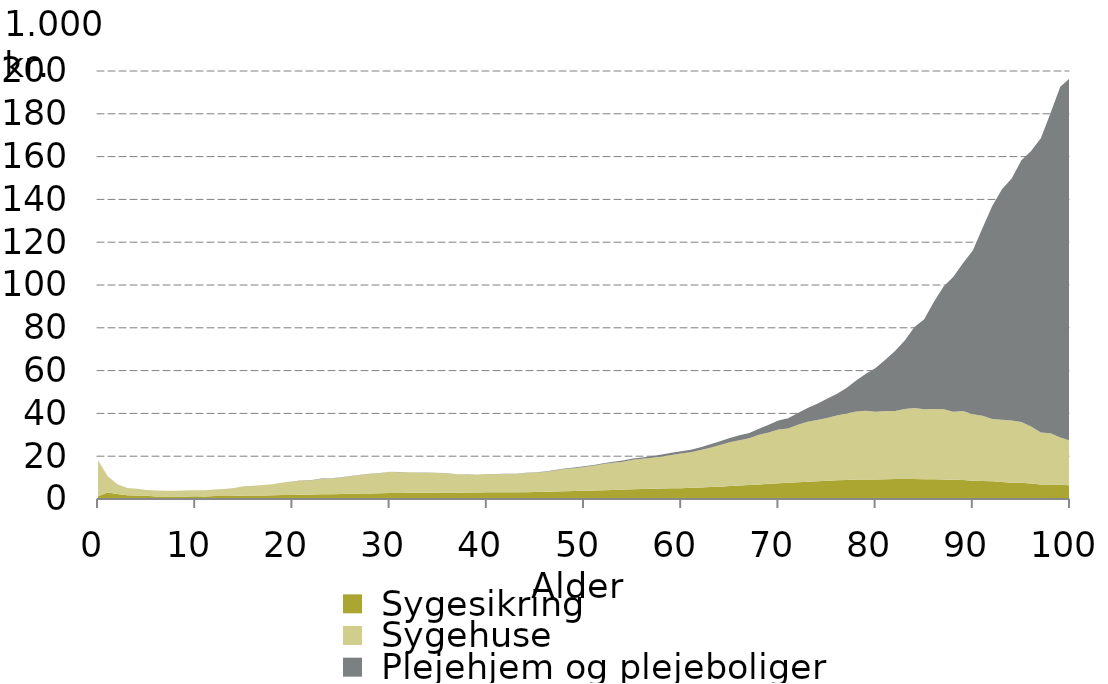
| Category |  Sygesikring |  Sygehuse |  Plejehjem og plejeboliger |
|---|---|---|---|
| 0.0 | 1.234 | 16.832 | 0.005 |
| 1.0 | 3.021 | 7.594 | 0.007 |
| 2.0 | 2.337 | 4.499 | 0.016 |
| 3.0 | 1.73 | 3.426 | 0.007 |
| 4.0 | 1.629 | 3.121 | 0.016 |
| 5.0 | 1.523 | 2.726 | 0.003 |
| 6.0 | 1.224 | 2.746 | 0.003 |
| 7.0 | 1.167 | 2.638 | 0.016 |
| 8.0 | 1.175 | 2.678 | 0.006 |
| 9.0 | 1.198 | 2.72 | 0.006 |
| 10.0 | 1.227 | 2.865 | 0.01 |
| 11.0 | 1.209 | 2.847 | 0.013 |
| 12.0 | 1.375 | 3.094 | 0.009 |
| 13.0 | 1.372 | 3.313 | 0.003 |
| 14.0 | 1.432 | 3.75 | 0.006 |
| 15.0 | 1.589 | 4.386 | 0.009 |
| 16.0 | 1.628 | 4.556 | 0.006 |
| 17.0 | 1.639 | 4.904 | 0.022 |
| 18.0 | 1.7 | 5.135 | 0.028 |
| 19.0 | 1.832 | 5.856 | 0.045 |
| 20.0 | 1.908 | 6.205 | 0.11 |
| 21.0 | 1.985 | 6.697 | 0.075 |
| 22.0 | 2.055 | 6.706 | 0.167 |
| 23.0 | 2.173 | 7.172 | 0.197 |
| 24.0 | 2.235 | 7.359 | 0.151 |
| 25.0 | 2.303 | 7.76 | 0.114 |
| 26.0 | 2.412 | 8.182 | 0.13 |
| 27.0 | 2.516 | 8.753 | 0.107 |
| 28.0 | 2.616 | 9.028 | 0.125 |
| 29.0 | 2.709 | 9.377 | 0.099 |
| 30.0 | 2.782 | 9.929 | 0.072 |
| 31.0 | 2.846 | 9.688 | 0.076 |
| 32.0 | 2.874 | 9.58 | 0.08 |
| 33.0 | 2.924 | 9.391 | 0.049 |
| 34.0 | 2.958 | 9.338 | 0.048 |
| 35.0 | 2.973 | 9.241 | 0.079 |
| 36.0 | 3.008 | 8.948 | 0.084 |
| 37.0 | 2.965 | 8.561 | 0.079 |
| 38.0 | 3.04 | 8.454 | 0.056 |
| 39.0 | 3.058 | 8.406 | 0.041 |
| 40.0 | 3.12 | 8.562 | 0.058 |
| 41.0 | 3.121 | 8.453 | 0.112 |
| 42.0 | 3.118 | 8.545 | 0.11 |
| 43.0 | 3.148 | 8.536 | 0.146 |
| 44.0 | 3.209 | 8.913 | 0.138 |
| 45.0 | 3.315 | 9.064 | 0.152 |
| 46.0 | 3.369 | 9.296 | 0.175 |
| 47.0 | 3.456 | 9.907 | 0.233 |
| 48.0 | 3.606 | 10.388 | 0.225 |
| 49.0 | 3.716 | 10.699 | 0.289 |
| 50.0 | 3.815 | 11.155 | 0.326 |
| 51.0 | 3.916 | 11.672 | 0.335 |
| 52.0 | 4.036 | 12.302 | 0.388 |
| 53.0 | 4.202 | 12.742 | 0.468 |
| 54.0 | 4.39 | 13.05 | 0.553 |
| 55.0 | 4.545 | 13.755 | 0.645 |
| 56.0 | 4.624 | 14.132 | 0.675 |
| 57.0 | 4.761 | 14.536 | 0.769 |
| 58.0 | 4.908 | 15.002 | 0.927 |
| 59.0 | 5.027 | 15.581 | 1.03 |
| 60.0 | 5.079 | 16.156 | 1.038 |
| 61.0 | 5.23 | 16.648 | 1.092 |
| 62.0 | 5.396 | 17.533 | 1.27 |
| 63.0 | 5.575 | 18.404 | 1.555 |
| 64.0 | 5.747 | 19.491 | 1.782 |
| 65.0 | 6.031 | 20.449 | 2.048 |
| 66.0 | 6.349 | 21.145 | 2.253 |
| 67.0 | 6.57 | 21.86 | 2.43 |
| 68.0 | 6.831 | 23.199 | 2.765 |
| 69.0 | 7.124 | 23.976 | 3.626 |
| 70.0 | 7.417 | 25.07 | 4.176 |
| 71.0 | 7.553 | 25.383 | 4.749 |
| 72.0 | 7.844 | 26.844 | 5.532 |
| 73.0 | 8.074 | 27.982 | 6.489 |
| 74.0 | 8.345 | 28.595 | 7.556 |
| 75.0 | 8.552 | 29.336 | 9.013 |
| 76.0 | 8.812 | 30.226 | 10.057 |
| 77.0 | 8.933 | 31.037 | 11.89 |
| 78.0 | 9.085 | 31.826 | 14.492 |
| 79.0 | 9.095 | 32.105 | 17.322 |
| 80.0 | 9.159 | 31.66 | 20.394 |
| 81.0 | 9.241 | 31.9 | 23.951 |
| 82.0 | 9.297 | 31.832 | 27.99 |
| 83.0 | 9.339 | 32.764 | 32.017 |
| 84.0 | 9.348 | 33.224 | 37.794 |
| 85.0 | 9.248 | 32.69 | 42.076 |
| 86.0 | 9.226 | 32.848 | 50.061 |
| 87.0 | 9.112 | 32.782 | 57.354 |
| 88.0 | 9.007 | 31.729 | 63.105 |
| 89.0 | 8.88 | 32.199 | 69.238 |
| 90.0 | 8.552 | 31.023 | 76.589 |
| 91.0 | 8.389 | 30.568 | 87.687 |
| 92.0 | 8.257 | 29.162 | 99.492 |
| 93.0 | 7.991 | 29.02 | 107.702 |
| 94.0 | 7.641 | 28.993 | 113.087 |
| 95.0 | 7.593 | 28.355 | 122.343 |
| 96.0 | 7.293 | 26.616 | 128.759 |
| 97.0 | 6.805 | 24.29 | 137.469 |
| 98.0 | 6.76 | 23.992 | 149.598 |
| 99.0 | 6.635 | 22.147 | 163.845 |
| 100.0 | 6.338 | 20.972 | 169.328 |